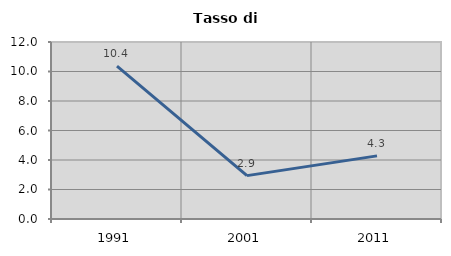
| Category | Tasso di disoccupazione   |
|---|---|
| 1991.0 | 10.363 |
| 2001.0 | 2.941 |
| 2011.0 | 4.28 |